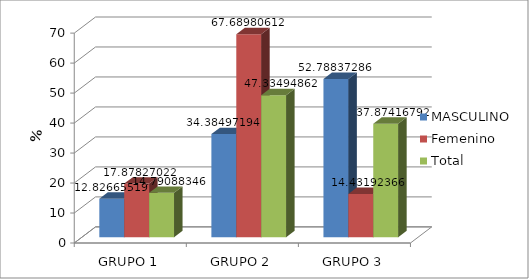
| Category | MASCULINO | Femenino | Total |
|---|---|---|---|
| GRUPO 1 | 12.827 | 17.878 | 14.791 |
| GRUPO 2 | 34.385 | 67.69 | 47.335 |
| GRUPO 3 | 52.788 | 14.432 | 37.874 |